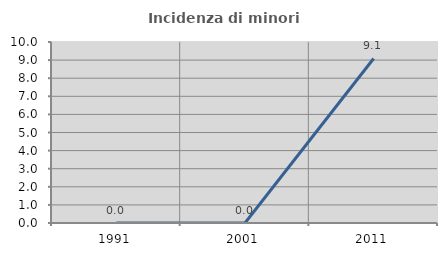
| Category | Incidenza di minori stranieri |
|---|---|
| 1991.0 | 0 |
| 2001.0 | 0 |
| 2011.0 | 9.091 |